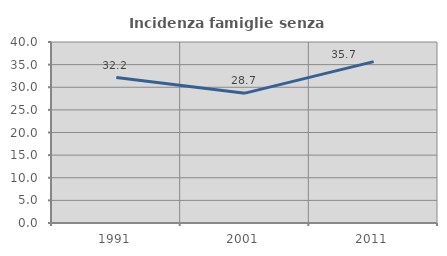
| Category | Incidenza famiglie senza nuclei |
|---|---|
| 1991.0 | 32.153 |
| 2001.0 | 28.695 |
| 2011.0 | 35.671 |